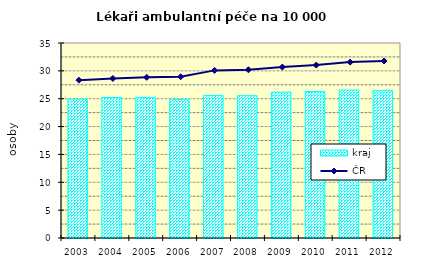
| Category | kraj |
|---|---|
| 2003.0 | 24.912 |
| 2004.0 | 25.217 |
| 2005.0 | 25.24 |
| 2006.0 | 24.875 |
| 2007.0 | 25.57 |
| 2008.0 | 25.547 |
| 2009.0 | 26.181 |
| 2010.0 | 26.287 |
| 2011.0 | 26.553 |
| 2012.0 | 26.446 |